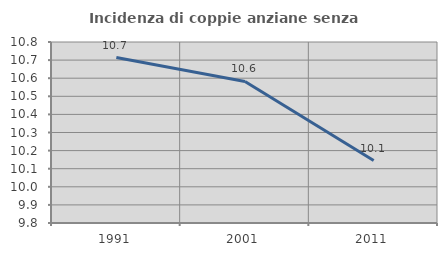
| Category | Incidenza di coppie anziane senza figli  |
|---|---|
| 1991.0 | 10.714 |
| 2001.0 | 10.582 |
| 2011.0 | 10.145 |